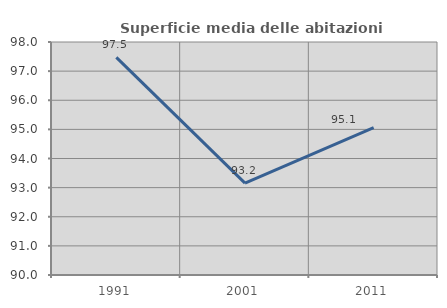
| Category | Superficie media delle abitazioni occupate |
|---|---|
| 1991.0 | 97.473 |
| 2001.0 | 93.152 |
| 2011.0 | 95.057 |